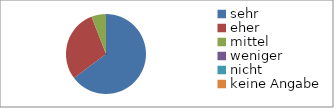
| Category | Series 0 |
|---|---|
| sehr | 11 |
| eher | 5 |
| mittel | 1 |
| weniger | 0 |
| nicht | 0 |
| keine Angabe | 0 |